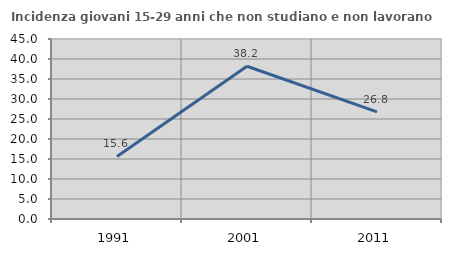
| Category | Incidenza giovani 15-29 anni che non studiano e non lavorano  |
|---|---|
| 1991.0 | 15.648 |
| 2001.0 | 38.181 |
| 2011.0 | 26.798 |